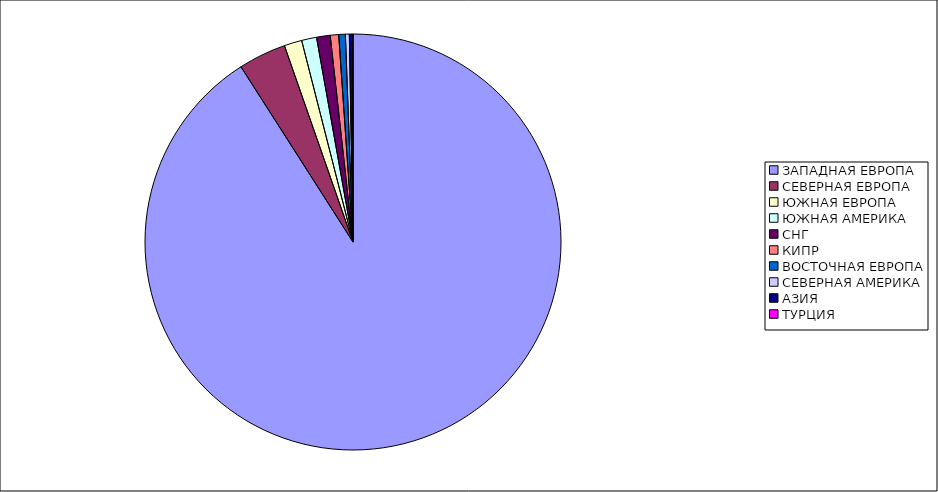
| Category | Оборот |
|---|---|
| ЗАПАДНАЯ ЕВРОПА | 0.909 |
| СЕВЕРНАЯ ЕВРОПА | 0.037 |
| ЮЖНАЯ ЕВРОПА | 0.014 |
| ЮЖНАЯ АМЕРИКА | 0.012 |
| СНГ | 0.011 |
| КИПР | 0.007 |
| ВОСТОЧНАЯ ЕВРОПА | 0.005 |
| СЕВЕРНАЯ АМЕРИКА | 0.003 |
| АЗИЯ | 0.003 |
| ТУРЦИЯ | 0 |